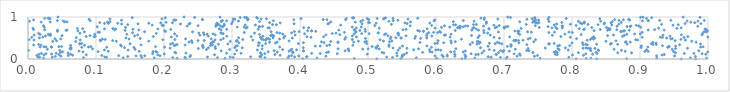
| Category | Series 0 |
|---|---|
| 0.9820237155277762 | 0.001 |
| 0.9606892863296531 | 0.002 |
| 0.8364236284019163 | 0.003 |
| 0.8059876734116665 | 0.004 |
| 0.5130100480650851 | 0.005 |
| 0.8804219526893031 | 0.006 |
| 0.638029327891563 | 0.007 |
| 0.4040769024165851 | 0.008 |
| 0.2321506576921416 | 0.009 |
| 0.5486184585720488 | 0.01 |
| 0.4798537133232941 | 0.011 |
| 0.8210705529351068 | 0.012 |
| 0.7032144940488393 | 0.013 |
| 0.28966138194487234 | 0.014 |
| 0.7530021376944878 | 0.015 |
| 0.6427787724256214 | 0.016 |
| 0.2190966261849845 | 0.017 |
| 0.9978363246223367 | 0.018 |
| 0.6008754354732732 | 0.019 |
| 0.022862955034226973 | 0.02 |
| 0.8278802184685365 | 0.021 |
| 0.6570197706996321 | 0.022 |
| 0.4250684938312945 | 0.023 |
| 0.9245568307182676 | 0.024 |
| 0.9741267631575841 | 0.025 |
| 0.18560820904018904 | 0.026 |
| 0.38245463822727577 | 0.027 |
| 0.571083161821015 | 0.028 |
| 0.1400159109689707 | 0.029 |
| 0.08172681960904493 | 0.03 |
| 0.27850951361379783 | 0.031 |
| 0.3484992823561228 | 0.032 |
| 0.21291082486531987 | 0.033 |
| 0.5360397298000905 | 0.034 |
| 0.30158092349296073 | 0.035 |
| 0.16735819332869462 | 0.036 |
| 0.6948147640590453 | 0.037 |
| 0.11551381445161002 | 0.038 |
| 0.7954055143838153 | 0.039 |
| 0.6809129613680677 | 0.04 |
| 0.01704602334797911 | 0.041 |
| 0.23081813353787672 | 0.042 |
| 0.03575051210806768 | 0.043 |
| 0.70461247113884 | 0.044 |
| 0.5275331840918445 | 0.045 |
| 0.2972841800074021 | 0.046 |
| 0.26401474665597213 | 0.047 |
| 0.3920937555393105 | 0.048 |
| 0.11289178382898091 | 0.049 |
| 0.014403096276654037 | 0.05 |
| 0.3274396747958692 | 0.051 |
| 0.4097343924431699 | 0.052 |
| 0.34230647078439935 | 0.053 |
| 0.6767059349250729 | 0.054 |
| 0.410171585921827 | 0.055 |
| 0.6106136305460482 | 0.056 |
| 0.2381317632535398 | 0.057 |
| 0.5503912635234847 | 0.058 |
| 0.3409363891057178 | 0.059 |
| 0.14677581353552316 | 0.06 |
| 0.9815375439607503 | 0.061 |
| 0.6438179158866972 | 0.062 |
| 0.040227484012471004 | 0.063 |
| 0.627723074326864 | 0.064 |
| 0.43804594061005164 | 0.065 |
| 0.7448583498282205 | 0.066 |
| 0.04852405895050971 | 0.067 |
| 0.7192229917885613 | 0.068 |
| 0.3836269853455506 | 0.069 |
| 0.3982727700855506 | 0.07 |
| 0.6165326580479878 | 0.071 |
| 0.950907663084872 | 0.072 |
| 0.15885404046930862 | 0.073 |
| 0.5984082457741023 | 0.074 |
| 0.5426927494904609 | 0.075 |
| 0.924429946750587 | 0.076 |
| 0.17173458236793515 | 0.077 |
| 0.19423035102766473 | 0.078 |
| 0.13340406238670532 | 0.079 |
| 0.16615588189324626 | 0.08 |
| 0.3876023170703282 | 0.081 |
| 0.0592992580331565 | 0.082 |
| 0.23905741617127463 | 0.083 |
| 0.10854172369300485 | 0.084 |
| 0.749263837226719 | 0.085 |
| 0.01306857007974005 | 0.086 |
| 0.816875588568198 | 0.087 |
| 0.7237967488754179 | 0.088 |
| 0.3706667621647749 | 0.089 |
| 0.5505115348392184 | 0.09 |
| 0.06558543916978654 | 0.091 |
| 0.6088904338981106 | 0.092 |
| 0.6163794020004832 | 0.093 |
| 0.8007807196141593 | 0.094 |
| 0.9322871692736093 | 0.095 |
| 0.1908788563519579 | 0.096 |
| 0.02355521034297625 | 0.097 |
| 0.642398874237236 | 0.098 |
| 0.7781490160102025 | 0.099 |
| 0.27435967341580825 | 0.1 |
| 0.08576950900530522 | 0.101 |
| 0.34379464783841485 | 0.102 |
| 0.045654119749743205 | 0.103 |
| 0.6585308561280027 | 0.104 |
| 0.6887936988136929 | 0.105 |
| 0.5532161981082593 | 0.106 |
| 0.9356669790642217 | 0.107 |
| 0.36308244300573866 | 0.108 |
| 0.662189983252518 | 0.109 |
| 0.6277457750274859 | 0.11 |
| 0.9967567121465104 | 0.111 |
| 0.016092431818726993 | 0.112 |
| 0.8302037820147334 | 0.113 |
| 0.7753630367596192 | 0.114 |
| 0.6883567456193915 | 0.115 |
| 0.49898890633261017 | 0.116 |
| 0.06250693057811374 | 0.117 |
| 0.3040178439055319 | 0.118 |
| 0.03453401458706329 | 0.119 |
| 0.2003317294510666 | 0.12 |
| 0.7229157486489256 | 0.121 |
| 0.8203554504957253 | 0.122 |
| 0.71485561304549 | 0.123 |
| 0.6517077181190913 | 0.124 |
| 0.991305843991673 | 0.125 |
| 0.026360807016835408 | 0.126 |
| 0.4548681149317597 | 0.127 |
| 0.1832628017602581 | 0.128 |
| 0.348227837110201 | 0.129 |
| 0.8366647357241516 | 0.13 |
| 0.429683455078808 | 0.131 |
| 0.9651922924092241 | 0.132 |
| 0.9792229851563662 | 0.133 |
| 0.019690815074225987 | 0.134 |
| 0.4171683022277295 | 0.135 |
| 0.3132697193081412 | 0.136 |
| 0.058722477102567394 | 0.137 |
| 0.04145348810819882 | 0.138 |
| 0.29192403984749493 | 0.139 |
| 0.23231425023993246 | 0.14 |
| 0.5423075300938703 | 0.141 |
| 0.5568810630417703 | 0.142 |
| 0.5234325338135053 | 0.143 |
| 0.6677126483640337 | 0.144 |
| 0.8876123500820694 | 0.145 |
| 0.21732017785451807 | 0.146 |
| 0.3420288789663799 | 0.147 |
| 0.3897978368709548 | 0.148 |
| 0.8673553567887037 | 0.149 |
| 0.9521324494905363 | 0.15 |
| 0.8095031139157824 | 0.151 |
| 0.6919654705720283 | 0.152 |
| 0.4390645086030931 | 0.153 |
| 0.04773916420443203 | 0.154 |
| 0.7426330722146502 | 0.155 |
| 0.5206923563772665 | 0.156 |
| 0.777968128466571 | 0.157 |
| 0.5803221751100077 | 0.158 |
| 0.8355685306816281 | 0.159 |
| 0.21593483658410484 | 0.16 |
| 0.18982579431960833 | 0.161 |
| 0.7737456233212103 | 0.162 |
| 0.3667023077500652 | 0.163 |
| 0.5942611724919312 | 0.164 |
| 0.38905639337552833 | 0.165 |
| 0.44196094130280317 | 0.166 |
| 0.9996740795209584 | 0.167 |
| 0.6399792874832673 | 0.168 |
| 0.6215140279441443 | 0.169 |
| 0.08082342568015766 | 0.17 |
| 0.6984765863302076 | 0.171 |
| 0.3532615866813025 | 0.172 |
| 0.05088860064342382 | 0.173 |
| 0.5910647815676306 | 0.174 |
| 0.10305783436555649 | 0.175 |
| 0.1838266490604975 | 0.176 |
| 0.6270656850748437 | 0.177 |
| 0.9492896823819952 | 0.178 |
| 0.907046171535984 | 0.179 |
| 0.18782329168618217 | 0.18 |
| 0.9120401767405729 | 0.181 |
| 0.7760206111982261 | 0.182 |
| 0.16358180662748711 | 0.183 |
| 0.8782984766890676 | 0.184 |
| 0.11794409618930357 | 0.185 |
| 0.38378017446208157 | 0.186 |
| 0.707818005920473 | 0.187 |
| 0.0750508055988035 | 0.188 |
| 0.6431186813401026 | 0.189 |
| 0.4050601253926115 | 0.19 |
| 0.28399612380980366 | 0.191 |
| 0.670488562375125 | 0.192 |
| 0.471926057198339 | 0.193 |
| 0.46613791566760643 | 0.194 |
| 0.7366467139475078 | 0.195 |
| 0.9865348174798804 | 0.196 |
| 0.40506413926592155 | 0.197 |
| 0.3619028081168266 | 0.198 |
| 0.8277098635526194 | 0.199 |
| 0.6949606722342313 | 0.2 |
| 0.7334246552115387 | 0.201 |
| 0.8391747015440991 | 0.202 |
| 0.6995880549903469 | 0.203 |
| 0.04677216508518556 | 0.204 |
| 0.000982857626944722 | 0.205 |
| 0.3068639141678252 | 0.206 |
| 0.6855103071868565 | 0.207 |
| 0.8727368136693147 | 0.208 |
| 0.6069185632094612 | 0.209 |
| 0.5442743501970786 | 0.21 |
| 0.38632670752084286 | 0.211 |
| 0.7944908598878357 | 0.212 |
| 0.1471699584721602 | 0.213 |
| 0.838507212682729 | 0.214 |
| 0.5995690660086823 | 0.215 |
| 0.3374070071663364 | 0.216 |
| 0.11238208836101293 | 0.217 |
| 0.3950660484095707 | 0.218 |
| 0.7812321009717689 | 0.219 |
| 0.9095649973670948 | 0.22 |
| 0.5672002099005888 | 0.221 |
| 0.6032636431727247 | 0.222 |
| 0.6784116702415836 | 0.223 |
| 0.5905397102636812 | 0.224 |
| 0.2623976252366681 | 0.225 |
| 0.3744389247392774 | 0.226 |
| 0.29655843453300534 | 0.227 |
| 0.9473092594198691 | 0.228 |
| 0.15755562604911155 | 0.229 |
| 0.028510880089395063 | 0.23 |
| 0.7166291555559697 | 0.231 |
| 0.8619711954861716 | 0.232 |
| 0.3879488496969309 | 0.233 |
| 0.4708192900192699 | 0.234 |
| 0.4708161584145252 | 0.235 |
| 0.4922735321749474 | 0.236 |
| 0.06341146742283998 | 0.237 |
| 0.5165916615173145 | 0.238 |
| 0.8264626826081126 | 0.239 |
| 0.3442552685908745 | 0.24 |
| 0.09488026989251508 | 0.241 |
| 0.5002761040758726 | 0.242 |
| 0.5743899402310497 | 0.243 |
| 0.45601421330717096 | 0.244 |
| 0.6293191458317371 | 0.245 |
| 0.7793463667793031 | 0.246 |
| 0.06179072693309007 | 0.247 |
| 0.9521993305187023 | 0.248 |
| 0.27567196291208496 | 0.249 |
| 0.7354239635916876 | 0.25 |
| 0.2505029411815737 | 0.251 |
| 0.8270742768065954 | 0.252 |
| 0.8338494571485648 | 0.253 |
| 0.8162621036816775 | 0.254 |
| 0.5572225155541106 | 0.255 |
| 0.8233692348931017 | 0.256 |
| 0.969962697528983 | 0.257 |
| 0.5123951678824007 | 0.258 |
| 0.20898285884014023 | 0.259 |
| 0.546843077542094 | 0.26 |
| 0.7606617449101575 | 0.261 |
| 0.5368228964586312 | 0.262 |
| 0.5116339104728372 | 0.263 |
| 0.7903150970007892 | 0.264 |
| 0.8206566049313058 | 0.265 |
| 0.2652023052099879 | 0.266 |
| 0.31505325163025033 | 0.267 |
| 0.6654499996689582 | 0.268 |
| 0.14184125715526263 | 0.269 |
| 0.40485421501589236 | 0.27 |
| 0.30396491866067565 | 0.271 |
| 0.5117971046889215 | 0.272 |
| 0.2576765930189888 | 0.273 |
| 0.9015166393770775 | 0.274 |
| 0.06303994156755655 | 0.275 |
| 0.15579455016217214 | 0.276 |
| 0.9406636820368691 | 0.277 |
| 0.07896794669713303 | 0.278 |
| 0.5933335884428564 | 0.279 |
| 0.1158011376618664 | 0.28 |
| 0.20090399249625035 | 0.281 |
| 0.03454321581189901 | 0.282 |
| 0.9892035213950818 | 0.283 |
| 0.017812450879829966 | 0.284 |
| 0.08897932584848467 | 0.285 |
| 0.9116221043724053 | 0.286 |
| 0.37011580653487886 | 0.287 |
| 0.9428310414204615 | 0.288 |
| 0.026511777116771662 | 0.289 |
| 0.03419220162966097 | 0.29 |
| 0.9928038651593944 | 0.291 |
| 0.0233391324886838 | 0.292 |
| 0.2753516163515537 | 0.293 |
| 0.0454616570893166 | 0.294 |
| 0.18750542841992235 | 0.295 |
| 0.09251729530425057 | 0.296 |
| 0.5061667562357576 | 0.297 |
| 0.049379370925289545 | 0.298 |
| 0.7101589192203704 | 0.299 |
| 0.7049683485475694 | 0.3 |
| 0.5310251636334389 | 0.301 |
| 0.9425994156699359 | 0.302 |
| 0.3053905043928311 | 0.303 |
| 0.6765174964210715 | 0.304 |
| 0.9525175015158068 | 0.305 |
| 0.25693181158850686 | 0.306 |
| 0.4225155383319661 | 0.307 |
| 0.5505553963677471 | 0.308 |
| 0.13725699085094922 | 0.309 |
| 0.4296931371178908 | 0.31 |
| 0.5140883817889274 | 0.311 |
| 0.9019993774264438 | 0.312 |
| 0.5866743117140605 | 0.313 |
| 0.7789886744724039 | 0.314 |
| 0.3077043962504519 | 0.315 |
| 0.34463498113898516 | 0.316 |
| 0.7966566707201745 | 0.317 |
| 0.9330868595852154 | 0.318 |
| 0.4395660274788271 | 0.319 |
| 0.3388244378375632 | 0.32 |
| 0.26835952779385974 | 0.321 |
| 0.215071808706071 | 0.322 |
| 0.7816413174518755 | 0.323 |
| 0.2567917440107682 | 0.324 |
| 0.06261635521769626 | 0.325 |
| 0.08291582959567545 | 0.326 |
| 0.4777497725937241 | 0.327 |
| 0.7106157486667767 | 0.328 |
| 0.2164912396436437 | 0.329 |
| 0.01897348160331902 | 0.33 |
| 0.13617575584727548 | 0.331 |
| 0.23096312321237644 | 0.332 |
| 0.008352318970055395 | 0.333 |
| 0.44342261809951466 | 0.334 |
| 0.530708829170277 | 0.335 |
| 0.16626905674033998 | 0.336 |
| 0.2713576600880456 | 0.337 |
| 0.8223867474418377 | 0.338 |
| 0.8164811533484534 | 0.339 |
| 0.9582082212176657 | 0.34 |
| 0.7100435054031176 | 0.341 |
| 0.7336788852381897 | 0.342 |
| 0.21909144842014572 | 0.343 |
| 0.9189857898706636 | 0.344 |
| 0.015676897312412286 | 0.345 |
| 0.6502090277586291 | 0.346 |
| 0.9239290422997696 | 0.347 |
| 0.8671827066236348 | 0.348 |
| 0.2799435495893886 | 0.349 |
| 0.8202041193581127 | 0.35 |
| 0.836232472561636 | 0.351 |
| 0.881098076354748 | 0.352 |
| 0.8564440935884047 | 0.353 |
| 0.20963535595354854 | 0.354 |
| 0.6602901356022093 | 0.355 |
| 0.988934771888009 | 0.356 |
| 0.29380054158482294 | 0.357 |
| 0.07627914312219952 | 0.358 |
| 0.6969667271035266 | 0.359 |
| 0.7655302261840022 | 0.36 |
| 0.766944534014855 | 0.361 |
| 0.15008283702144765 | 0.362 |
| 0.6870902520843613 | 0.363 |
| 0.9169112082065902 | 0.364 |
| 0.07582578828680542 | 0.365 |
| 0.3494313519689365 | 0.366 |
| 0.3978051778505661 | 0.367 |
| 0.49831172971843085 | 0.368 |
| 0.773946552107553 | 0.369 |
| 0.5982883945704305 | 0.37 |
| 0.2688258901800349 | 0.371 |
| 0.07896291649015319 | 0.372 |
| 0.8578882421935287 | 0.373 |
| 0.6636399982270437 | 0.374 |
| 0.678633816399363 | 0.375 |
| 0.6022127602891696 | 0.376 |
| 0.2127090540215537 | 0.377 |
| 0.9236396950611582 | 0.378 |
| 0.6932820331341852 | 0.379 |
| 0.3402663883022552 | 0.38 |
| 0.36389467610351844 | 0.381 |
| 0.8000187265991415 | 0.382 |
| 0.6224599952250972 | 0.383 |
| 0.7218849649865604 | 0.384 |
| 0.3392061557575917 | 0.385 |
| 0.611398297216024 | 0.386 |
| 0.8153141001268801 | 0.387 |
| 0.40503610141559665 | 0.388 |
| 0.3099300842735062 | 0.389 |
| 0.43536260622593026 | 0.39 |
| 0.4557633433792797 | 0.391 |
| 0.6535504023712957 | 0.392 |
| 0.5765191763031061 | 0.393 |
| 0.24143041491421358 | 0.394 |
| 0.9189950658702646 | 0.395 |
| 0.6648657409335268 | 0.396 |
| 0.3553191787819697 | 0.397 |
| 0.8785790478542682 | 0.398 |
| 0.6903969094627483 | 0.399 |
| 0.9825670495007224 | 0.4 |
| 0.885750679747376 | 0.401 |
| 0.36648912272068246 | 0.402 |
| 0.47906812989941494 | 0.403 |
| 0.2367716966918153 | 0.404 |
| 0.2714646943508393 | 0.405 |
| 0.4952607333782698 | 0.406 |
| 0.45601866505275146 | 0.407 |
| 0.27303493933481726 | 0.408 |
| 0.431542811125572 | 0.409 |
| 0.5315442015882479 | 0.41 |
| 0.8796578606054638 | 0.411 |
| 0.7438378929332177 | 0.412 |
| 0.6283646648376192 | 0.413 |
| 0.662579214185683 | 0.414 |
| 0.0702439725123275 | 0.415 |
| 0.6605062007525935 | 0.416 |
| 0.44512804128699757 | 0.417 |
| 0.29742869191310606 | 0.418 |
| 0.49757226123071174 | 0.419 |
| 0.03641246638201301 | 0.42 |
| 0.8499118683593889 | 0.421 |
| 0.12992993207626669 | 0.422 |
| 0.9760718726179761 | 0.423 |
| 0.3062535527655542 | 0.424 |
| 0.4858644480970927 | 0.425 |
| 0.17757192288445245 | 0.426 |
| 0.5226857322907515 | 0.427 |
| 0.5350743123429063 | 0.428 |
| 0.7160991941964554 | 0.429 |
| 0.3839392973912862 | 0.43 |
| 0.8647914780832399 | 0.431 |
| 0.6219545980027305 | 0.432 |
| 0.042047828277960275 | 0.433 |
| 0.10668921206304416 | 0.434 |
| 0.24041422029334059 | 0.435 |
| 0.6031328598125698 | 0.436 |
| 0.9515223862451602 | 0.437 |
| 0.12444438836480043 | 0.438 |
| 0.25000302799008967 | 0.439 |
| 0.7214614455988251 | 0.44 |
| 0.2591406166263093 | 0.441 |
| 0.7143503509978361 | 0.442 |
| 0.3074774271685857 | 0.443 |
| 0.7168801895258381 | 0.444 |
| 0.717780344032367 | 0.445 |
| 0.10613200870723993 | 0.446 |
| 0.7280010514414521 | 0.447 |
| 0.8223008878593753 | 0.448 |
| 0.34974748215030527 | 0.449 |
| 0.9668583481522278 | 0.45 |
| 0.8963833059450702 | 0.451 |
| 0.3306343702657981 | 0.452 |
| 0.008911271385734887 | 0.453 |
| 0.07679183782489996 | 0.454 |
| 0.27509241804943285 | 0.455 |
| 0.28347368009728446 | 0.456 |
| 0.5177300375083415 | 0.457 |
| 0.19825941252374035 | 0.458 |
| 0.34637817480645916 | 0.459 |
| 0.8937218214531003 | 0.46 |
| 0.7464262741380124 | 0.461 |
| 0.0016186934216358972 | 0.462 |
| 0.21599399774666483 | 0.463 |
| 0.3157745464077697 | 0.464 |
| 0.11346179144311119 | 0.465 |
| 0.47681828461678144 | 0.466 |
| 0.827145967101793 | 0.467 |
| 0.35533983732046337 | 0.468 |
| 0.960220695237749 | 0.469 |
| 0.6374013618959822 | 0.47 |
| 0.34374592853504127 | 0.471 |
| 0.46595216146531404 | 0.472 |
| 0.10948880084198642 | 0.473 |
| 0.14867577273152655 | 0.474 |
| 0.3699706323815509 | 0.475 |
| 0.048073905096779 | 0.476 |
| 0.7354804435073975 | 0.477 |
| 0.8314303931846648 | 0.478 |
| 0.269297877173028 | 0.479 |
| 0.23179433944604477 | 0.48 |
| 0.945133001031143 | 0.481 |
| 0.039641352417362996 | 0.482 |
| 0.350685702368551 | 0.483 |
| 0.532818516511047 | 0.484 |
| 0.8066582883228417 | 0.485 |
| 0.9475634447321889 | 0.486 |
| 0.28733202704564786 | 0.487 |
| 0.35331882383271707 | 0.488 |
| 0.5773846492256156 | 0.489 |
| 0.16500269552829772 | 0.49 |
| 0.49626847937764784 | 0.491 |
| 0.568877902881556 | 0.492 |
| 0.8334558255058548 | 0.493 |
| 0.7383626401375579 | 0.494 |
| 0.6934801586252107 | 0.495 |
| 0.8293517190600024 | 0.496 |
| 0.5483917695284504 | 0.497 |
| 0.3887476993895239 | 0.498 |
| 0.9392686906878251 | 0.499 |
| 0.14406796440484226 | 0.5 |
| 0.5863577428260236 | 0.501 |
| 0.01685964844582377 | 0.502 |
| 0.376208451319482 | 0.503 |
| 0.5488120593241332 | 0.504 |
| 0.36047489210636785 | 0.505 |
| 0.5410239588124564 | 0.506 |
| 0.07100102055454427 | 0.507 |
| 0.3098032218080625 | 0.508 |
| 0.6618094349909183 | 0.509 |
| 0.4671864013368423 | 0.51 |
| 0.9329019502278965 | 0.511 |
| 0.9648582315950273 | 0.512 |
| 0.34270121349725446 | 0.513 |
| 0.34187001496011615 | 0.514 |
| 0.005457304747001124 | 0.515 |
| 0.7975312020098205 | 0.516 |
| 0.41617241538765815 | 0.517 |
| 0.685228558434897 | 0.518 |
| 0.9031201657220442 | 0.519 |
| 0.9297013701370171 | 0.52 |
| 0.5335898758940627 | 0.521 |
| 0.021783590896380267 | 0.522 |
| 0.6207313577804892 | 0.523 |
| 0.21082627706186552 | 0.524 |
| 0.9997397880897396 | 0.525 |
| 0.7082964924825893 | 0.526 |
| 0.48291487445161485 | 0.527 |
| 0.09729664776254798 | 0.528 |
| 0.8316332091364264 | 0.529 |
| 0.434754892983762 | 0.53 |
| 0.4101615956040022 | 0.531 |
| 0.3281749956925365 | 0.532 |
| 0.9704291515914204 | 0.533 |
| 0.1843268399648076 | 0.534 |
| 0.7836568276137272 | 0.535 |
| 0.35991090315194774 | 0.536 |
| 0.08561256045750865 | 0.537 |
| 0.8742409186166223 | 0.538 |
| 0.09884200384244801 | 0.539 |
| 0.5699940986156361 | 0.54 |
| 0.29238293303331775 | 0.541 |
| 0.2651042142112259 | 0.542 |
| 0.3775678464454104 | 0.543 |
| 0.34541734937858093 | 0.544 |
| 0.9440934989131404 | 0.545 |
| 0.5939489950982281 | 0.546 |
| 0.2189528655818137 | 0.547 |
| 0.02568053727834918 | 0.548 |
| 0.36118744237701506 | 0.549 |
| 0.15686286644068503 | 0.55 |
| 0.4769756199623857 | 0.551 |
| 0.5558996347295995 | 0.552 |
| 0.5293368395502688 | 0.553 |
| 0.6637236934852858 | 0.554 |
| 0.5861647064622518 | 0.555 |
| 0.09118538466282189 | 0.556 |
| 0.8524129692806777 | 0.557 |
| 0.049986808476290556 | 0.558 |
| 0.65232932397737 | 0.559 |
| 0.03277446273354745 | 0.56 |
| 0.3570320202490177 | 0.561 |
| 0.8768460045865295 | 0.562 |
| 0.9337833139971291 | 0.563 |
| 0.7710636214005802 | 0.564 |
| 0.6122299483583618 | 0.565 |
| 0.2527985732194755 | 0.566 |
| 0.545103615822316 | 0.567 |
| 0.00895836429692054 | 0.568 |
| 0.6798980711813917 | 0.569 |
| 0.39288178212562574 | 0.57 |
| 0.8610255553014798 | 0.571 |
| 0.16126369417167685 | 0.572 |
| 0.6141060462247622 | 0.573 |
| 0.2754183014853928 | 0.574 |
| 0.4381844485248745 | 0.575 |
| 0.9910586193311351 | 0.576 |
| 0.9608773037692488 | 0.577 |
| 0.35880300395387 | 0.578 |
| 0.4585578468222863 | 0.579 |
| 0.2588419412547518 | 0.58 |
| 0.5240689249664906 | 0.581 |
| 0.8134438383906661 | 0.582 |
| 0.34038788196419734 | 0.583 |
| 0.029830704324170232 | 0.584 |
| 0.017822096164145762 | 0.585 |
| 0.7231959155643951 | 0.586 |
| 0.8806496795795467 | 0.587 |
| 0.14532728664179462 | 0.588 |
| 0.6221498164312617 | 0.589 |
| 0.26343740827942863 | 0.59 |
| 0.03302963887750443 | 0.591 |
| 0.09812365135073076 | 0.592 |
| 0.7895967676311845 | 0.593 |
| 0.3746923405140564 | 0.594 |
| 0.8921361718341361 | 0.595 |
| 0.9004892121955245 | 0.596 |
| 0.5865788146820723 | 0.597 |
| 0.2720844637325779 | 0.598 |
| 0.21553583257902897 | 0.599 |
| 0.40684686617323074 | 0.6 |
| 0.5262169267113435 | 0.601 |
| 0.4799114993376751 | 0.602 |
| 0.5016284374307046 | 0.603 |
| 0.4907404617703409 | 0.604 |
| 0.2869991867469077 | 0.605 |
| 0.44747452921219466 | 0.606 |
| 0.992240557411725 | 0.607 |
| 0.5437998997295416 | 0.608 |
| 0.18860473528945443 | 0.609 |
| 0.28440526189079496 | 0.61 |
| 0.7207778871171565 | 0.611 |
| 0.015573569479650162 | 0.612 |
| 0.07642493624290603 | 0.613 |
| 0.45297813431284606 | 0.614 |
| 0.5445686034057671 | 0.615 |
| 0.37019061073945836 | 0.616 |
| 0.6760395783306377 | 0.617 |
| 0.33310675454549643 | 0.618 |
| 0.25122763497712275 | 0.619 |
| 0.5149322292971292 | 0.62 |
| 0.2835957094894571 | 0.621 |
| 0.38767808705505635 | 0.622 |
| 0.2580652162764402 | 0.623 |
| 0.5151287039296747 | 0.624 |
| 0.6705741158796388 | 0.625 |
| 0.1538149021941846 | 0.626 |
| 0.5892764310561802 | 0.627 |
| 0.6025662599029934 | 0.628 |
| 0.3661693373961986 | 0.629 |
| 0.7660066944674626 | 0.63 |
| 0.31802901140245343 | 0.631 |
| 0.8004214285005162 | 0.632 |
| 0.5964647658925324 | 0.633 |
| 0.9032128191359627 | 0.634 |
| 0.465278203320889 | 0.635 |
| 0.1030870518191862 | 0.636 |
| 0.6066728145691672 | 0.637 |
| 0.10502645409809941 | 0.638 |
| 0.7742195018910848 | 0.639 |
| 0.7403175107584014 | 0.64 |
| 0.7956130383090253 | 0.641 |
| 0.691923825882009 | 0.642 |
| 0.48239951525127955 | 0.643 |
| 0.9977122592953681 | 0.644 |
| 0.0828761401740632 | 0.645 |
| 0.2420103702151779 | 0.646 |
| 0.7346784781566736 | 0.647 |
| 0.9940303661435751 | 0.648 |
| 0.17141754449002478 | 0.649 |
| 0.35747142303066515 | 0.65 |
| 0.39874897017413813 | 0.651 |
| 0.871609372193246 | 0.652 |
| 0.39185734382571225 | 0.653 |
| 0.6053289104533015 | 0.654 |
| 0.20232381908136887 | 0.655 |
| 0.49621221588052733 | 0.656 |
| 0.5816120720565998 | 0.657 |
| 0.04332529337734192 | 0.658 |
| 0.8733722521096249 | 0.659 |
| 0.4232780889026223 | 0.66 |
| 0.5757904022150316 | 0.661 |
| 0.5815315979844784 | 0.662 |
| 0.7222538569788783 | 0.663 |
| 0.7202497232504084 | 0.664 |
| 0.7159852689226257 | 0.665 |
| 0.8761783453012316 | 0.666 |
| 0.9972415224316719 | 0.667 |
| 0.07334542703510893 | 0.668 |
| 0.4171644122341599 | 0.669 |
| 0.4170022199328999 | 0.67 |
| 0.9992693383188075 | 0.671 |
| 0.8771188822107594 | 0.672 |
| 0.41127883423208655 | 0.673 |
| 0.20089065976616627 | 0.674 |
| 0.48072599040484154 | 0.675 |
| 0.6701461902887259 | 0.676 |
| 0.8325421600885433 | 0.677 |
| 0.5732103057225212 | 0.678 |
| 0.48803184659686827 | 0.679 |
| 0.6282977683022047 | 0.68 |
| 0.14273431140546333 | 0.681 |
| 0.055943188706034985 | 0.682 |
| 0.8522592483208699 | 0.683 |
| 0.8843458500717317 | 0.684 |
| 0.6527171755920607 | 0.685 |
| 0.04347922572543961 | 0.686 |
| 0.4570679968994805 | 0.687 |
| 0.6624304086112393 | 0.688 |
| 0.935493622191111 | 0.689 |
| 0.05761173555808852 | 0.69 |
| 0.912100467446262 | 0.691 |
| 0.28405643085925236 | 0.692 |
| 0.1629709219513511 | 0.693 |
| 0.8556253920266479 | 0.694 |
| 0.5515338861020815 | 0.695 |
| 0.12725837302288856 | 0.696 |
| 0.8659316190533598 | 0.697 |
| 0.024646659661654358 | 0.698 |
| 0.8171071260196291 | 0.699 |
| 0.921506928653554 | 0.7 |
| 0.479778792701706 | 0.701 |
| 0.008079205869843897 | 0.702 |
| 0.8415781344399003 | 0.703 |
| 0.5560316499814555 | 0.704 |
| 0.20997217774701038 | 0.705 |
| 0.4958139953274433 | 0.706 |
| 0.29220456689462093 | 0.707 |
| 0.1542852423774672 | 0.708 |
| 0.9969913572484753 | 0.709 |
| 0.33855329592603045 | 0.71 |
| 0.6781974139707818 | 0.711 |
| 0.8180589182921408 | 0.712 |
| 0.12896704868357445 | 0.713 |
| 0.6590139360214301 | 0.714 |
| 0.19110632774761582 | 0.715 |
| 0.9954881544140971 | 0.716 |
| 0.11248952056367145 | 0.717 |
| 0.5869851933075383 | 0.718 |
| 0.7779526787699829 | 0.719 |
| 0.2812273770688304 | 0.72 |
| 0.8558813669012252 | 0.721 |
| 0.08047827331324786 | 0.722 |
| 0.8107099477171656 | 0.723 |
| 0.6778404675062387 | 0.724 |
| 0.12472413617087141 | 0.725 |
| 0.8535088972095961 | 0.726 |
| 0.07266993753798123 | 0.727 |
| 0.9541340107020271 | 0.728 |
| 0.7252097053466291 | 0.729 |
| 0.6540498846204585 | 0.73 |
| 0.635197905180039 | 0.731 |
| 0.007329935256204512 | 0.732 |
| 0.927438312145616 | 0.733 |
| 0.5164405426224716 | 0.734 |
| 0.5985226215885536 | 0.735 |
| 0.3209437672320349 | 0.736 |
| 0.7006118679277824 | 0.737 |
| 0.3550111261245341 | 0.738 |
| 0.48289524461561606 | 0.739 |
| 0.7857070246524319 | 0.74 |
| 0.9604941599026554 | 0.741 |
| 0.7705098707664751 | 0.742 |
| 0.6870034261078197 | 0.743 |
| 0.6317586146020435 | 0.744 |
| 0.3530512020140646 | 0.745 |
| 0.4125432449918619 | 0.746 |
| 0.4053276821403591 | 0.747 |
| 0.6555395984976345 | 0.748 |
| 0.751716194820605 | 0.749 |
| 0.8291078973355468 | 0.75 |
| 0.7759834407489972 | 0.751 |
| 0.143485753344476 | 0.752 |
| 0.8506302453779974 | 0.753 |
| 0.6079805299129708 | 0.754 |
| 0.9010238963689989 | 0.755 |
| 0.6999713743044133 | 0.756 |
| 0.3222692434242517 | 0.757 |
| 0.02378677013798869 | 0.758 |
| 0.3178489917860978 | 0.759 |
| 0.6201516718231382 | 0.76 |
| 0.3076040959510825 | 0.761 |
| 0.49003171253398026 | 0.762 |
| 0.4768197520234263 | 0.763 |
| 0.6896354316757968 | 0.764 |
| 0.64005611351217 | 0.765 |
| 0.28623189665113447 | 0.766 |
| 0.33972535854026187 | 0.767 |
| 0.10192957568620109 | 0.768 |
| 0.702862429589519 | 0.769 |
| 0.34077620921465945 | 0.77 |
| 0.8808584839497537 | 0.771 |
| 0.7648111488949537 | 0.772 |
| 0.7056903595267958 | 0.773 |
| 0.6342111756925575 | 0.774 |
| 0.8855290978396542 | 0.775 |
| 0.6359940729206313 | 0.776 |
| 0.34494995675693396 | 0.777 |
| 0.9849374531727972 | 0.778 |
| 0.2760892905653479 | 0.779 |
| 0.8662551400921539 | 0.78 |
| 0.7862512222707772 | 0.781 |
| 0.2835232840609171 | 0.782 |
| 0.2339093571153067 | 0.783 |
| 0.6697359177692456 | 0.784 |
| 0.8867972894453574 | 0.785 |
| 0.6466893992542941 | 0.786 |
| 0.7852960669590313 | 0.787 |
| 0.6431586113699944 | 0.788 |
| 0.8981470504778319 | 0.789 |
| 0.6125104716285289 | 0.79 |
| 0.5620214548680214 | 0.791 |
| 0.0228452338907309 | 0.792 |
| 0.25015478131801683 | 0.793 |
| 0.7461271102122096 | 0.794 |
| 0.19914890385955442 | 0.795 |
| 0.5099548156516743 | 0.796 |
| 0.6931000701104358 | 0.797 |
| 0.8060195992793898 | 0.798 |
| 0.2884831947253478 | 0.799 |
| 0.5936665494218376 | 0.8 |
| 0.8945645296634076 | 0.801 |
| 0.1976327008917912 | 0.802 |
| 0.19762922545127426 | 0.803 |
| 0.6852216384236699 | 0.804 |
| 0.9485230223619115 | 0.805 |
| 0.27799541329747124 | 0.806 |
| 0.4598537576270205 | 0.807 |
| 0.18261115513113424 | 0.808 |
| 0.7739555305994973 | 0.809 |
| 0.33443269105526485 | 0.81 |
| 0.858564066309054 | 0.811 |
| 0.3193779266462825 | 0.812 |
| 0.6258884715030495 | 0.813 |
| 0.6289269840313741 | 0.814 |
| 0.9562497833807222 | 0.815 |
| 0.3653663404857964 | 0.816 |
| 0.8382522972917561 | 0.817 |
| 0.14670969366758013 | 0.818 |
| 0.6552082795929868 | 0.819 |
| 0.3596078507245155 | 0.82 |
| 0.2806289220188939 | 0.821 |
| 0.8234040229912476 | 0.822 |
| 0.659395774982898 | 0.823 |
| 0.7327539418054613 | 0.824 |
| 0.931760894482419 | 0.825 |
| 0.5344211408967032 | 0.826 |
| 0.7977837205880114 | 0.827 |
| 0.28870189026111526 | 0.828 |
| 0.8688628799218808 | 0.829 |
| 0.2365901776948911 | 0.83 |
| 0.2767725577652582 | 0.831 |
| 0.13775577867933408 | 0.832 |
| 0.22423738374606816 | 0.833 |
| 0.7773263197383276 | 0.834 |
| 0.8473641188265959 | 0.835 |
| 0.4912970017584727 | 0.836 |
| 0.4409158202249449 | 0.837 |
| 0.16173585467030016 | 0.838 |
| 0.391248014420447 | 0.839 |
| 0.29940032785005055 | 0.84 |
| 0.8146641015234207 | 0.841 |
| 0.9894986069036232 | 0.842 |
| 0.5575977206186424 | 0.843 |
| 0.9663154922073449 | 0.844 |
| 0.4422627810466172 | 0.845 |
| 0.11239713044177546 | 0.846 |
| 0.6740401906753175 | 0.847 |
| 0.11835507256936384 | 0.848 |
| 0.23819662111268025 | 0.849 |
| 0.17771092903172725 | 0.85 |
| 0.131933216740323 | 0.851 |
| 0.5119169039262367 | 0.852 |
| 0.7492283332986068 | 0.853 |
| 0.8180505603067986 | 0.854 |
| 0.2780724208094739 | 0.855 |
| 0.8476752867343539 | 0.856 |
| 0.5908858058389397 | 0.857 |
| 0.8124046891222932 | 0.858 |
| 0.37082771146626115 | 0.859 |
| 0.1950502704270497 | 0.86 |
| 0.5541707113047345 | 0.861 |
| 0.857316219218176 | 0.862 |
| 0.21233752624744984 | 0.863 |
| 0.5022423875789851 | 0.864 |
| 0.9804256275138099 | 0.865 |
| 0.3552818391723772 | 0.866 |
| 0.10548460971761209 | 0.867 |
| 0.7512234699330215 | 0.868 |
| 0.8723698675523486 | 0.869 |
| 0.7849384972105837 | 0.87 |
| 0.7458139371538465 | 0.871 |
| 0.2031024017480434 | 0.872 |
| 0.5005592065745128 | 0.873 |
| 0.7467914916597086 | 0.874 |
| 0.7422706458031221 | 0.875 |
| 0.9745832742885339 | 0.876 |
| 0.11686156556567273 | 0.877 |
| 0.48133001367962813 | 0.878 |
| 0.019322450998924046 | 0.879 |
| 0.03259361680389872 | 0.88 |
| 0.8181070183911271 | 0.881 |
| 0.6741621737579089 | 0.882 |
| 0.5625735228850399 | 0.883 |
| 0.057531538614011835 | 0.884 |
| 0.44526395012869147 | 0.885 |
| 0.7231479770308558 | 0.886 |
| 0.05411362021202126 | 0.887 |
| 0.12078507732029053 | 0.888 |
| 0.6256352013487267 | 0.889 |
| 0.30095373956309623 | 0.89 |
| 0.8592802604799121 | 0.891 |
| 0.34050214606680396 | 0.892 |
| 0.48931272628420563 | 0.893 |
| 0.7662815100737964 | 0.894 |
| 0.2841461165303979 | 0.895 |
| 0.5308363308821786 | 0.896 |
| 0.80946542379963 | 0.897 |
| 0.002154080856419771 | 0.898 |
| 0.8421675451397613 | 0.899 |
| 0.05213750407239992 | 0.9 |
| 0.9852203889150767 | 0.901 |
| 0.6561395226350447 | 0.902 |
| 0.9693039146315519 | 0.903 |
| 0.28512586979407095 | 0.904 |
| 0.30962353894700956 | 0.905 |
| 0.5971281843199858 | 0.906 |
| 0.9034511950150786 | 0.907 |
| 0.2920125676387437 | 0.908 |
| 0.7438443693124512 | 0.909 |
| 0.9123784241663593 | 0.91 |
| 0.9119165206816258 | 0.911 |
| 0.3609474572386355 | 0.912 |
| 0.5371050345806754 | 0.913 |
| 0.09158372183781827 | 0.914 |
| 0.043221615080144216 | 0.915 |
| 0.6402460733612307 | 0.916 |
| 0.2860525982544396 | 0.917 |
| 0.9944610856540033 | 0.918 |
| 0.8693004772262395 | 0.919 |
| 0.9289256997225762 | 0.92 |
| 0.9454659447304729 | 0.921 |
| 0.5439307479322402 | 0.922 |
| 0.49228346279717916 | 0.923 |
| 0.1375343470741418 | 0.924 |
| 0.21588245414253004 | 0.925 |
| 0.8848429224236581 | 0.926 |
| 0.21442181517025716 | 0.927 |
| 0.7508687865018697 | 0.928 |
| 0.21743446416645418 | 0.929 |
| 0.3230155986388844 | 0.93 |
| 0.5982113486516971 | 0.931 |
| 0.008212915684733813 | 0.932 |
| 0.8755393366802415 | 0.933 |
| 0.7465047065888044 | 0.934 |
| 0.3908619321387443 | 0.935 |
| 0.4396882166512761 | 0.936 |
| 0.46702731939590336 | 0.937 |
| 0.25670709203710196 | 0.938 |
| 0.8627388484722323 | 0.939 |
| 0.4341161965843354 | 0.94 |
| 0.5011708764516948 | 0.941 |
| 0.25633940030373614 | 0.942 |
| 0.6708202577736933 | 0.943 |
| 0.8832086816369147 | 0.944 |
| 0.7337206893755308 | 0.945 |
| 0.08984050224033835 | 0.946 |
| 0.3043613892721193 | 0.947 |
| 0.7647994442115026 | 0.948 |
| 0.32391829161879293 | 0.949 |
| 0.30189067757422006 | 0.95 |
| 0.5588747630711761 | 0.951 |
| 0.6909593973913792 | 0.952 |
| 0.34288416717791637 | 0.953 |
| 0.5229139326710921 | 0.954 |
| 0.19696617992355214 | 0.955 |
| 0.12052965881691191 | 0.956 |
| 0.03251705334373556 | 0.957 |
| 0.35075935144295456 | 0.958 |
| 0.5237946604127817 | 0.959 |
| 0.8408031210657596 | 0.96 |
| 0.7413353225711427 | 0.961 |
| 0.40167381196589236 | 0.962 |
| 0.49873690595695974 | 0.963 |
| 0.46821702280091115 | 0.964 |
| 0.7915941174563683 | 0.965 |
| 0.5135383558229034 | 0.966 |
| 0.5366862080422032 | 0.967 |
| 0.9096356570136808 | 0.968 |
| 0.024605292628809394 | 0.969 |
| 0.02956707435349859 | 0.97 |
| 0.33764256175188934 | 0.971 |
| 0.5730779597666749 | 0.972 |
| 0.030601847234011492 | 0.973 |
| 0.666101404908597 | 0.974 |
| 0.3215953960245156 | 0.975 |
| 0.478927315638609 | 0.976 |
| 0.7451572749534242 | 0.977 |
| 0.6711625799166465 | 0.978 |
| 0.5257261387737734 | 0.979 |
| 0.4770749175430403 | 0.98 |
| 0.4785572385016794 | 0.981 |
| 0.2020398104208896 | 0.982 |
| 0.9170797378516761 | 0.983 |
| 0.7454504326731122 | 0.984 |
| 0.15325228509149436 | 0.985 |
| 0.32150957785320566 | 0.986 |
| 0.7095444333531555 | 0.987 |
| 0.33624502429098835 | 0.988 |
| 0.3120072060543353 | 0.989 |
| 0.2450993295314987 | 0.99 |
| 0.9882502701103262 | 0.991 |
| 0.3187248707974335 | 0.992 |
| 0.9008960394703749 | 0.993 |
| 0.7661883028590047 | 0.994 |
| 0.9045941926043305 | 0.995 |
| 0.2822722925242419 | 0.996 |
| 0.9634146004447467 | 0.997 |
| 0.7054562146500254 | 0.998 |
| 0.04417870907816224 | 0.999 |
| 0.22947972105017045 | 1 |